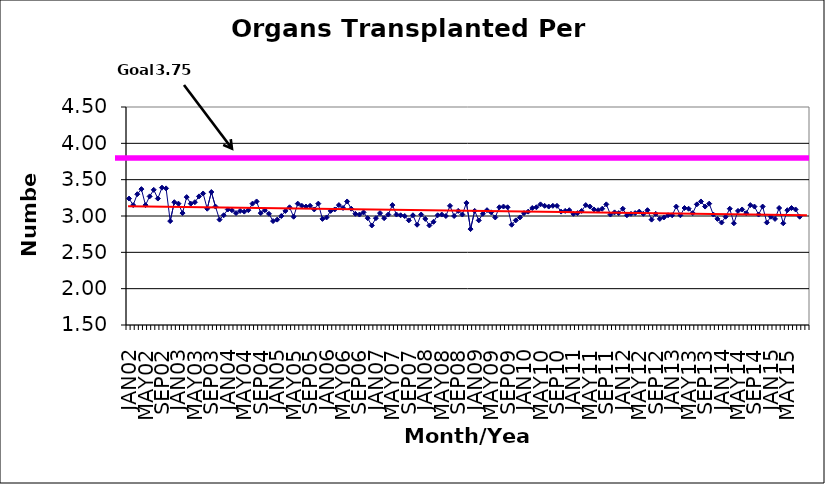
| Category | Series 0 |
|---|---|
| JAN02 | 3.24 |
| FEB02 | 3.15 |
| MAR02 | 3.3 |
| APR02 | 3.37 |
| MAY02 | 3.15 |
| JUN02 | 3.27 |
| JUL02 | 3.36 |
| AUG02 | 3.24 |
| SEP02 | 3.39 |
| OCT02 | 3.38 |
| NOV02 | 2.93 |
| DEC02 | 3.19 |
| JAN03 | 3.17 |
| FEB03 | 3.04 |
| MAR03 | 3.26 |
| APR03 | 3.17 |
| MAY03 | 3.19 |
| JUN03 | 3.27 |
| JUL03 | 3.31 |
| AUG03 | 3.1 |
| SEP03 | 3.33 |
| OCT03 | 3.13 |
| NOV03 | 2.95 |
| DEC03 | 3.01 |
| JAN04 | 3.09 |
| FEB04 | 3.08 |
| MAR04 | 3.04 |
| APR04 | 3.07 |
| MAY04 | 3.06 |
| JUN04 | 3.08 |
| JUL04 | 3.17 |
| AUG04 | 3.2 |
| SEP04 | 3.04 |
| OCT04 | 3.08 |
| NOV04 | 3.03 |
| DEC04 | 2.93 |
| JAN05 | 2.95 |
| FEB05 | 3 |
| MAR05 | 3.07 |
| APR05 | 3.12 |
| MAY05 | 2.99 |
| JUN05 | 3.17 |
| JUL05 | 3.14 |
| AUG05 | 3.13 |
| SEP05 | 3.14 |
| OCT05 | 3.09 |
| NOV05 | 3.17 |
| DEC05 | 2.96 |
| JAN06 | 2.98 |
| FEB06 | 3.07 |
| MAR06 | 3.09 |
| APR06 | 3.15 |
| MAY06 | 3.11 |
| JUN06 | 3.2 |
| JUL06 | 3.1 |
| AUG06 | 3.03 |
| SEP06 | 3.02 |
| OCT06 | 3.05 |
| NOV06 | 2.97 |
| DEC06 | 2.87 |
| JAN07 | 2.97 |
| FEB07 | 3.04 |
| MAR07 | 2.97 |
| APR07 | 3.02 |
| MAY07 | 3.15 |
| JUN07 | 3.02 |
| JUL07 | 3.01 |
| AUG07 | 3 |
| SEP07 | 2.94 |
| OCT07 | 3.01 |
| NOV07 | 2.88 |
| DEC07 | 3.02 |
| JAN08 | 2.96 |
| FEB08 | 2.87 |
| MAR08 | 2.92 |
| APR08 | 3.01 |
| MAY08 | 3.02 |
| JUN08 | 3 |
| JUL08 | 3.14 |
| AUG08 | 3 |
| SEP08 | 3.07 |
| OCT08 | 3.02 |
| NOV08 | 3.18 |
| DEC08 | 2.82 |
| JAN09 | 3.07 |
| FEB09 | 2.94 |
| MAR09 | 3.03 |
| APR09 | 3.08 |
| MAY09 | 3.05 |
| JUN09 | 2.98 |
| JUL09 | 3.12 |
| AUG09 | 3.13 |
| SEP09 | 3.12 |
| OCT09 | 2.88 |
| NOV09 | 2.94 |
| DEC09 | 2.98 |
| JAN10 | 3.04 |
| FEB10 | 3.06 |
| MAR10 | 3.11 |
| APR10 | 3.12 |
| MAY10 | 3.16 |
| JUN10 | 3.14 |
| JUL10 | 3.13 |
| AUG10 | 3.14 |
| SEP10 | 3.14 |
| OCT10 | 3.06 |
| NOV10 | 3.07 |
| DEC10 | 3.08 |
| JAN11 | 3.03 |
| FEB11 | 3.04 |
| MAR11 | 3.07 |
| APR11 | 3.15 |
| MAY11 | 3.13 |
| JUN11 | 3.09 |
| JUL11 | 3.08 |
| AUG11 | 3.1 |
| SEP11 | 3.16 |
| OCT11 | 3.02 |
| NOV11 | 3.05 |
| DEC11 | 3.04 |
| JAN12 | 3.1 |
| FEB12 | 3.01 |
| MAR12 | 3.03 |
| APR12 | 3.04 |
| MAY12 | 3.06 |
| JUN12 | 3.03 |
| JUL12 | 3.08 |
| AUG12 | 2.95 |
| SEP12 | 3.03 |
| OCT12 | 2.96 |
| NOV12 | 2.98 |
| DEC12 | 3.01 |
| JAN13 | 3.01 |
| FEB13 | 3.13 |
| MAR13 | 3.01 |
| APR13 | 3.11 |
| MAY13 | 3.1 |
| JUN13 | 3.04 |
| JUL13 | 3.16 |
| AUG13 | 3.2 |
| SEP13 | 3.13 |
| OCT13 | 3.17 |
| NOV13 | 3.02 |
| DEC13 | 2.96 |
| JAN14 | 2.91 |
| FEB14 | 2.99 |
| MAR14 | 3.1 |
| APR14 | 2.9 |
| MAY14 | 3.07 |
| JUN14 | 3.09 |
| JUL14 | 3.04 |
| AUG14 | 3.15 |
| SEP14 | 3.13 |
| OCT14 | 3.02 |
| NOV14 | 3.13 |
| DEC14 | 2.91 |
| JAN15 | 2.99 |
| FEB15 | 2.96 |
| MAR15 | 3.11 |
| APR15 | 2.9 |
| MAY15 | 3.08 |
| JUN15 | 3.11 |
| JUL15 | 3.09 |
| AUG15 | 2.99 |